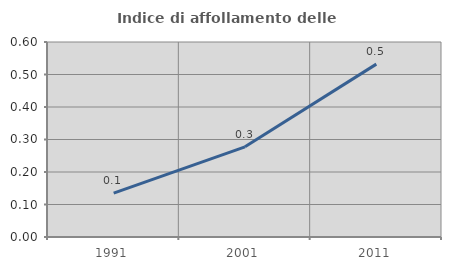
| Category | Indice di affollamento delle abitazioni  |
|---|---|
| 1991.0 | 0.135 |
| 2001.0 | 0.277 |
| 2011.0 | 0.532 |